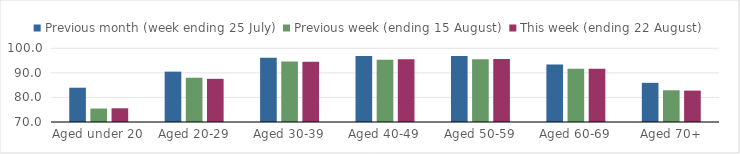
| Category | Previous month (week ending 25 July) | Previous week (ending 15 August) | This week (ending 22 August) |
|---|---|---|---|
| Aged under 20 | 83.956 | 75.483 | 75.577 |
| Aged 20-29 | 90.497 | 88.018 | 87.575 |
| Aged 30-39 | 96.118 | 94.604 | 94.472 |
| Aged 40-49 | 96.908 | 95.383 | 95.503 |
| Aged 50-59 | 96.911 | 95.544 | 95.655 |
| Aged 60-69 | 93.436 | 91.689 | 91.692 |
| Aged 70+ | 85.938 | 82.913 | 82.774 |